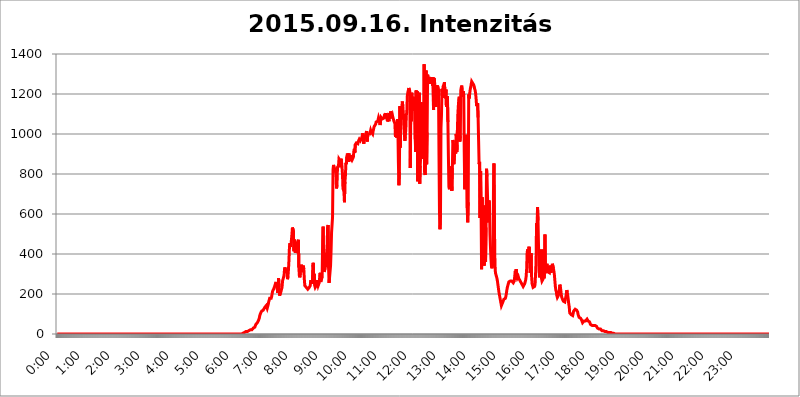
| Category | 2015.09.16. Intenzitás [W/m^2] |
|---|---|
| 0.0 | 0 |
| 0.0006944444444444445 | 0 |
| 0.001388888888888889 | 0 |
| 0.0020833333333333333 | 0 |
| 0.002777777777777778 | 0 |
| 0.003472222222222222 | 0 |
| 0.004166666666666667 | 0 |
| 0.004861111111111111 | 0 |
| 0.005555555555555556 | 0 |
| 0.0062499999999999995 | 0 |
| 0.006944444444444444 | 0 |
| 0.007638888888888889 | 0 |
| 0.008333333333333333 | 0 |
| 0.009027777777777779 | 0 |
| 0.009722222222222222 | 0 |
| 0.010416666666666666 | 0 |
| 0.011111111111111112 | 0 |
| 0.011805555555555555 | 0 |
| 0.012499999999999999 | 0 |
| 0.013194444444444444 | 0 |
| 0.013888888888888888 | 0 |
| 0.014583333333333332 | 0 |
| 0.015277777777777777 | 0 |
| 0.015972222222222224 | 0 |
| 0.016666666666666666 | 0 |
| 0.017361111111111112 | 0 |
| 0.018055555555555557 | 0 |
| 0.01875 | 0 |
| 0.019444444444444445 | 0 |
| 0.02013888888888889 | 0 |
| 0.020833333333333332 | 0 |
| 0.02152777777777778 | 0 |
| 0.022222222222222223 | 0 |
| 0.02291666666666667 | 0 |
| 0.02361111111111111 | 0 |
| 0.024305555555555556 | 0 |
| 0.024999999999999998 | 0 |
| 0.025694444444444447 | 0 |
| 0.02638888888888889 | 0 |
| 0.027083333333333334 | 0 |
| 0.027777777777777776 | 0 |
| 0.02847222222222222 | 0 |
| 0.029166666666666664 | 0 |
| 0.029861111111111113 | 0 |
| 0.030555555555555555 | 0 |
| 0.03125 | 0 |
| 0.03194444444444445 | 0 |
| 0.03263888888888889 | 0 |
| 0.03333333333333333 | 0 |
| 0.034027777777777775 | 0 |
| 0.034722222222222224 | 0 |
| 0.035416666666666666 | 0 |
| 0.036111111111111115 | 0 |
| 0.03680555555555556 | 0 |
| 0.0375 | 0 |
| 0.03819444444444444 | 0 |
| 0.03888888888888889 | 0 |
| 0.03958333333333333 | 0 |
| 0.04027777777777778 | 0 |
| 0.04097222222222222 | 0 |
| 0.041666666666666664 | 0 |
| 0.042361111111111106 | 0 |
| 0.04305555555555556 | 0 |
| 0.043750000000000004 | 0 |
| 0.044444444444444446 | 0 |
| 0.04513888888888889 | 0 |
| 0.04583333333333334 | 0 |
| 0.04652777777777778 | 0 |
| 0.04722222222222222 | 0 |
| 0.04791666666666666 | 0 |
| 0.04861111111111111 | 0 |
| 0.049305555555555554 | 0 |
| 0.049999999999999996 | 0 |
| 0.05069444444444445 | 0 |
| 0.051388888888888894 | 0 |
| 0.052083333333333336 | 0 |
| 0.05277777777777778 | 0 |
| 0.05347222222222222 | 0 |
| 0.05416666666666667 | 0 |
| 0.05486111111111111 | 0 |
| 0.05555555555555555 | 0 |
| 0.05625 | 0 |
| 0.05694444444444444 | 0 |
| 0.057638888888888885 | 0 |
| 0.05833333333333333 | 0 |
| 0.05902777777777778 | 0 |
| 0.059722222222222225 | 0 |
| 0.06041666666666667 | 0 |
| 0.061111111111111116 | 0 |
| 0.06180555555555556 | 0 |
| 0.0625 | 0 |
| 0.06319444444444444 | 0 |
| 0.06388888888888888 | 0 |
| 0.06458333333333334 | 0 |
| 0.06527777777777778 | 0 |
| 0.06597222222222222 | 0 |
| 0.06666666666666667 | 0 |
| 0.06736111111111111 | 0 |
| 0.06805555555555555 | 0 |
| 0.06874999999999999 | 0 |
| 0.06944444444444443 | 0 |
| 0.07013888888888889 | 0 |
| 0.07083333333333333 | 0 |
| 0.07152777777777779 | 0 |
| 0.07222222222222223 | 0 |
| 0.07291666666666667 | 0 |
| 0.07361111111111111 | 0 |
| 0.07430555555555556 | 0 |
| 0.075 | 0 |
| 0.07569444444444444 | 0 |
| 0.0763888888888889 | 0 |
| 0.07708333333333334 | 0 |
| 0.07777777777777778 | 0 |
| 0.07847222222222222 | 0 |
| 0.07916666666666666 | 0 |
| 0.0798611111111111 | 0 |
| 0.08055555555555556 | 0 |
| 0.08125 | 0 |
| 0.08194444444444444 | 0 |
| 0.08263888888888889 | 0 |
| 0.08333333333333333 | 0 |
| 0.08402777777777777 | 0 |
| 0.08472222222222221 | 0 |
| 0.08541666666666665 | 0 |
| 0.08611111111111112 | 0 |
| 0.08680555555555557 | 0 |
| 0.08750000000000001 | 0 |
| 0.08819444444444445 | 0 |
| 0.08888888888888889 | 0 |
| 0.08958333333333333 | 0 |
| 0.09027777777777778 | 0 |
| 0.09097222222222222 | 0 |
| 0.09166666666666667 | 0 |
| 0.09236111111111112 | 0 |
| 0.09305555555555556 | 0 |
| 0.09375 | 0 |
| 0.09444444444444444 | 0 |
| 0.09513888888888888 | 0 |
| 0.09583333333333333 | 0 |
| 0.09652777777777777 | 0 |
| 0.09722222222222222 | 0 |
| 0.09791666666666667 | 0 |
| 0.09861111111111111 | 0 |
| 0.09930555555555555 | 0 |
| 0.09999999999999999 | 0 |
| 0.10069444444444443 | 0 |
| 0.1013888888888889 | 0 |
| 0.10208333333333335 | 0 |
| 0.10277777777777779 | 0 |
| 0.10347222222222223 | 0 |
| 0.10416666666666667 | 0 |
| 0.10486111111111111 | 0 |
| 0.10555555555555556 | 0 |
| 0.10625 | 0 |
| 0.10694444444444444 | 0 |
| 0.1076388888888889 | 0 |
| 0.10833333333333334 | 0 |
| 0.10902777777777778 | 0 |
| 0.10972222222222222 | 0 |
| 0.1111111111111111 | 0 |
| 0.11180555555555556 | 0 |
| 0.11180555555555556 | 0 |
| 0.1125 | 0 |
| 0.11319444444444444 | 0 |
| 0.11388888888888889 | 0 |
| 0.11458333333333333 | 0 |
| 0.11527777777777777 | 0 |
| 0.11597222222222221 | 0 |
| 0.11666666666666665 | 0 |
| 0.1173611111111111 | 0 |
| 0.11805555555555557 | 0 |
| 0.11944444444444445 | 0 |
| 0.12013888888888889 | 0 |
| 0.12083333333333333 | 0 |
| 0.12152777777777778 | 0 |
| 0.12222222222222223 | 0 |
| 0.12291666666666667 | 0 |
| 0.12291666666666667 | 0 |
| 0.12361111111111112 | 0 |
| 0.12430555555555556 | 0 |
| 0.125 | 0 |
| 0.12569444444444444 | 0 |
| 0.12638888888888888 | 0 |
| 0.12708333333333333 | 0 |
| 0.16875 | 0 |
| 0.12847222222222224 | 0 |
| 0.12916666666666668 | 0 |
| 0.12986111111111112 | 0 |
| 0.13055555555555556 | 0 |
| 0.13125 | 0 |
| 0.13194444444444445 | 0 |
| 0.1326388888888889 | 0 |
| 0.13333333333333333 | 0 |
| 0.13402777777777777 | 0 |
| 0.13402777777777777 | 0 |
| 0.13472222222222222 | 0 |
| 0.13541666666666666 | 0 |
| 0.1361111111111111 | 0 |
| 0.13749999999999998 | 0 |
| 0.13819444444444443 | 0 |
| 0.1388888888888889 | 0 |
| 0.13958333333333334 | 0 |
| 0.14027777777777778 | 0 |
| 0.14097222222222222 | 0 |
| 0.14166666666666666 | 0 |
| 0.1423611111111111 | 0 |
| 0.14305555555555557 | 0 |
| 0.14375000000000002 | 0 |
| 0.14444444444444446 | 0 |
| 0.1451388888888889 | 0 |
| 0.1451388888888889 | 0 |
| 0.14652777777777778 | 0 |
| 0.14722222222222223 | 0 |
| 0.14791666666666667 | 0 |
| 0.1486111111111111 | 0 |
| 0.14930555555555555 | 0 |
| 0.15 | 0 |
| 0.15069444444444444 | 0 |
| 0.15138888888888888 | 0 |
| 0.15208333333333332 | 0 |
| 0.15277777777777776 | 0 |
| 0.15347222222222223 | 0 |
| 0.15416666666666667 | 0 |
| 0.15486111111111112 | 0 |
| 0.15555555555555556 | 0 |
| 0.15625 | 0 |
| 0.15694444444444444 | 0 |
| 0.15763888888888888 | 0 |
| 0.15833333333333333 | 0 |
| 0.15902777777777777 | 0 |
| 0.15972222222222224 | 0 |
| 0.16041666666666668 | 0 |
| 0.16111111111111112 | 0 |
| 0.16180555555555556 | 0 |
| 0.1625 | 0 |
| 0.16319444444444445 | 0 |
| 0.1638888888888889 | 0 |
| 0.16458333333333333 | 0 |
| 0.16527777777777777 | 0 |
| 0.16597222222222222 | 0 |
| 0.16666666666666666 | 0 |
| 0.1673611111111111 | 0 |
| 0.16805555555555554 | 0 |
| 0.16874999999999998 | 0 |
| 0.16944444444444443 | 0 |
| 0.17013888888888887 | 0 |
| 0.1708333333333333 | 0 |
| 0.17152777777777775 | 0 |
| 0.17222222222222225 | 0 |
| 0.1729166666666667 | 0 |
| 0.17361111111111113 | 0 |
| 0.17430555555555557 | 0 |
| 0.17500000000000002 | 0 |
| 0.17569444444444446 | 0 |
| 0.1763888888888889 | 0 |
| 0.17708333333333334 | 0 |
| 0.17777777777777778 | 0 |
| 0.17847222222222223 | 0 |
| 0.17916666666666667 | 0 |
| 0.1798611111111111 | 0 |
| 0.18055555555555555 | 0 |
| 0.18125 | 0 |
| 0.18194444444444444 | 0 |
| 0.1826388888888889 | 0 |
| 0.18333333333333335 | 0 |
| 0.1840277777777778 | 0 |
| 0.18472222222222223 | 0 |
| 0.18541666666666667 | 0 |
| 0.18611111111111112 | 0 |
| 0.18680555555555556 | 0 |
| 0.1875 | 0 |
| 0.18819444444444444 | 0 |
| 0.18888888888888888 | 0 |
| 0.18958333333333333 | 0 |
| 0.19027777777777777 | 0 |
| 0.1909722222222222 | 0 |
| 0.19166666666666665 | 0 |
| 0.19236111111111112 | 0 |
| 0.19305555555555554 | 0 |
| 0.19375 | 0 |
| 0.19444444444444445 | 0 |
| 0.1951388888888889 | 0 |
| 0.19583333333333333 | 0 |
| 0.19652777777777777 | 0 |
| 0.19722222222222222 | 0 |
| 0.19791666666666666 | 0 |
| 0.1986111111111111 | 0 |
| 0.19930555555555554 | 0 |
| 0.19999999999999998 | 0 |
| 0.20069444444444443 | 0 |
| 0.20138888888888887 | 0 |
| 0.2020833333333333 | 0 |
| 0.2027777777777778 | 0 |
| 0.2034722222222222 | 0 |
| 0.2041666666666667 | 0 |
| 0.20486111111111113 | 0 |
| 0.20555555555555557 | 0 |
| 0.20625000000000002 | 0 |
| 0.20694444444444446 | 0 |
| 0.2076388888888889 | 0 |
| 0.20833333333333334 | 0 |
| 0.20902777777777778 | 0 |
| 0.20972222222222223 | 0 |
| 0.21041666666666667 | 0 |
| 0.2111111111111111 | 0 |
| 0.21180555555555555 | 0 |
| 0.2125 | 0 |
| 0.21319444444444444 | 0 |
| 0.2138888888888889 | 0 |
| 0.21458333333333335 | 0 |
| 0.2152777777777778 | 0 |
| 0.21597222222222223 | 0 |
| 0.21666666666666667 | 0 |
| 0.21736111111111112 | 0 |
| 0.21805555555555556 | 0 |
| 0.21875 | 0 |
| 0.21944444444444444 | 0 |
| 0.22013888888888888 | 0 |
| 0.22083333333333333 | 0 |
| 0.22152777777777777 | 0 |
| 0.2222222222222222 | 0 |
| 0.22291666666666665 | 0 |
| 0.2236111111111111 | 0 |
| 0.22430555555555556 | 0 |
| 0.225 | 0 |
| 0.22569444444444445 | 0 |
| 0.2263888888888889 | 0 |
| 0.22708333333333333 | 0 |
| 0.22777777777777777 | 0 |
| 0.22847222222222222 | 0 |
| 0.22916666666666666 | 0 |
| 0.2298611111111111 | 0 |
| 0.23055555555555554 | 0 |
| 0.23124999999999998 | 0 |
| 0.23194444444444443 | 0 |
| 0.23263888888888887 | 0 |
| 0.2333333333333333 | 0 |
| 0.2340277777777778 | 0 |
| 0.2347222222222222 | 0 |
| 0.2354166666666667 | 0 |
| 0.23611111111111113 | 0 |
| 0.23680555555555557 | 0 |
| 0.23750000000000002 | 0 |
| 0.23819444444444446 | 0 |
| 0.2388888888888889 | 0 |
| 0.23958333333333334 | 0 |
| 0.24027777777777778 | 0 |
| 0.24097222222222223 | 0 |
| 0.24166666666666667 | 0 |
| 0.2423611111111111 | 0 |
| 0.24305555555555555 | 0 |
| 0.24375 | 0 |
| 0.24444444444444446 | 0 |
| 0.24513888888888888 | 0 |
| 0.24583333333333335 | 0 |
| 0.2465277777777778 | 0 |
| 0.24722222222222223 | 0 |
| 0.24791666666666667 | 0 |
| 0.24861111111111112 | 0 |
| 0.24930555555555556 | 0 |
| 0.25 | 0 |
| 0.25069444444444444 | 0 |
| 0.2513888888888889 | 0 |
| 0.2520833333333333 | 0 |
| 0.25277777777777777 | 0 |
| 0.2534722222222222 | 0 |
| 0.25416666666666665 | 0 |
| 0.2548611111111111 | 0 |
| 0.2555555555555556 | 0 |
| 0.25625000000000003 | 0 |
| 0.2569444444444445 | 0 |
| 0.2576388888888889 | 0 |
| 0.25833333333333336 | 0 |
| 0.2590277777777778 | 0 |
| 0.25972222222222224 | 3.525 |
| 0.2604166666666667 | 3.525 |
| 0.2611111111111111 | 3.525 |
| 0.26180555555555557 | 3.525 |
| 0.2625 | 7.887 |
| 0.26319444444444445 | 7.887 |
| 0.2638888888888889 | 7.887 |
| 0.26458333333333334 | 12.257 |
| 0.2652777777777778 | 12.257 |
| 0.2659722222222222 | 12.257 |
| 0.26666666666666666 | 12.257 |
| 0.2673611111111111 | 12.257 |
| 0.26805555555555555 | 16.636 |
| 0.26875 | 16.636 |
| 0.26944444444444443 | 16.636 |
| 0.2701388888888889 | 21.024 |
| 0.2708333333333333 | 21.024 |
| 0.27152777777777776 | 21.024 |
| 0.2722222222222222 | 21.024 |
| 0.27291666666666664 | 21.024 |
| 0.2736111111111111 | 25.419 |
| 0.2743055555555555 | 25.419 |
| 0.27499999999999997 | 29.823 |
| 0.27569444444444446 | 29.823 |
| 0.27638888888888885 | 34.234 |
| 0.27708333333333335 | 34.234 |
| 0.2777777777777778 | 38.653 |
| 0.27847222222222223 | 47.511 |
| 0.2791666666666667 | 47.511 |
| 0.2798611111111111 | 47.511 |
| 0.28055555555555556 | 56.398 |
| 0.28125 | 60.85 |
| 0.28194444444444444 | 65.31 |
| 0.2826388888888889 | 69.775 |
| 0.2833333333333333 | 78.722 |
| 0.28402777777777777 | 92.184 |
| 0.2847222222222222 | 96.682 |
| 0.28541666666666665 | 105.69 |
| 0.28611111111111115 | 110.201 |
| 0.28680555555555554 | 114.716 |
| 0.28750000000000003 | 114.716 |
| 0.2881944444444445 | 110.201 |
| 0.2888888888888889 | 119.235 |
| 0.28958333333333336 | 123.758 |
| 0.2902777777777778 | 114.716 |
| 0.29097222222222224 | 132.814 |
| 0.2916666666666667 | 137.347 |
| 0.2923611111111111 | 128.284 |
| 0.29305555555555557 | 141.884 |
| 0.29375 | 141.884 |
| 0.29444444444444445 | 128.284 |
| 0.2951388888888889 | 137.347 |
| 0.29583333333333334 | 146.423 |
| 0.2965277777777778 | 160.056 |
| 0.2972222222222222 | 169.156 |
| 0.29791666666666666 | 178.264 |
| 0.2986111111111111 | 178.264 |
| 0.29930555555555555 | 178.264 |
| 0.3 | 178.264 |
| 0.30069444444444443 | 187.378 |
| 0.3013888888888889 | 191.937 |
| 0.3020833333333333 | 214.746 |
| 0.30277777777777776 | 219.309 |
| 0.3034722222222222 | 223.873 |
| 0.30416666666666664 | 228.436 |
| 0.3048611111111111 | 237.564 |
| 0.3055555555555555 | 246.689 |
| 0.30624999999999997 | 251.251 |
| 0.3069444444444444 | 260.373 |
| 0.3076388888888889 | 237.564 |
| 0.30833333333333335 | 246.689 |
| 0.3090277777777778 | 205.62 |
| 0.30972222222222223 | 219.309 |
| 0.3104166666666667 | 278.603 |
| 0.3111111111111111 | 233 |
| 0.31180555555555556 | 191.937 |
| 0.3125 | 191.937 |
| 0.31319444444444444 | 191.937 |
| 0.3138888888888889 | 214.746 |
| 0.3145833333333333 | 219.309 |
| 0.31527777777777777 | 233 |
| 0.3159722222222222 | 264.932 |
| 0.31666666666666665 | 274.047 |
| 0.31736111111111115 | 269.49 |
| 0.31805555555555554 | 292.259 |
| 0.31875000000000003 | 324.052 |
| 0.3194444444444445 | 333.113 |
| 0.3201388888888889 | 319.517 |
| 0.32083333333333336 | 305.898 |
| 0.3215277777777778 | 324.052 |
| 0.32222222222222224 | 314.98 |
| 0.3229166666666667 | 274.047 |
| 0.3236111111111111 | 287.709 |
| 0.32430555555555557 | 324.052 |
| 0.325 | 369.23 |
| 0.32569444444444445 | 436.27 |
| 0.3263888888888889 | 453.968 |
| 0.32708333333333334 | 436.27 |
| 0.3277777777777778 | 445.129 |
| 0.3284722222222222 | 440.702 |
| 0.32916666666666666 | 497.836 |
| 0.3298611111111111 | 532.513 |
| 0.33055555555555555 | 528.2 |
| 0.33125 | 515.223 |
| 0.33194444444444443 | 414.035 |
| 0.3326388888888889 | 471.582 |
| 0.3333333333333333 | 467.187 |
| 0.3340277777777778 | 405.108 |
| 0.3347222222222222 | 418.492 |
| 0.3354166666666667 | 422.943 |
| 0.3361111111111111 | 436.27 |
| 0.3368055555555556 | 458.38 |
| 0.33749999999999997 | 458.38 |
| 0.33819444444444446 | 471.582 |
| 0.33888888888888885 | 333.113 |
| 0.33958333333333335 | 292.259 |
| 0.34027777777777773 | 283.156 |
| 0.34097222222222223 | 305.898 |
| 0.3416666666666666 | 333.113 |
| 0.3423611111111111 | 346.682 |
| 0.3430555555555555 | 328.584 |
| 0.34375 | 324.052 |
| 0.3444444444444445 | 319.517 |
| 0.3451388888888889 | 342.162 |
| 0.3458333333333334 | 324.052 |
| 0.34652777777777777 | 274.047 |
| 0.34722222222222227 | 242.127 |
| 0.34791666666666665 | 237.564 |
| 0.34861111111111115 | 242.127 |
| 0.34930555555555554 | 233 |
| 0.35000000000000003 | 228.436 |
| 0.3506944444444444 | 228.436 |
| 0.3513888888888889 | 223.873 |
| 0.3520833333333333 | 228.436 |
| 0.3527777777777778 | 228.436 |
| 0.3534722222222222 | 233 |
| 0.3541666666666667 | 233 |
| 0.3548611111111111 | 242.127 |
| 0.35555555555555557 | 269.49 |
| 0.35625 | 274.047 |
| 0.35694444444444445 | 264.932 |
| 0.3576388888888889 | 251.251 |
| 0.35833333333333334 | 251.251 |
| 0.3590277777777778 | 355.712 |
| 0.3597222222222222 | 287.709 |
| 0.36041666666666666 | 301.354 |
| 0.3611111111111111 | 242.127 |
| 0.36180555555555555 | 233 |
| 0.3625 | 233 |
| 0.36319444444444443 | 242.127 |
| 0.3638888888888889 | 260.373 |
| 0.3645833333333333 | 269.49 |
| 0.3652777777777778 | 264.932 |
| 0.3659722222222222 | 242.127 |
| 0.3666666666666667 | 242.127 |
| 0.3673611111111111 | 255.813 |
| 0.3680555555555556 | 283.156 |
| 0.36874999999999997 | 305.898 |
| 0.36944444444444446 | 260.373 |
| 0.37013888888888885 | 255.813 |
| 0.37083333333333335 | 264.932 |
| 0.37152777777777773 | 287.709 |
| 0.37222222222222223 | 467.187 |
| 0.3729166666666666 | 536.82 |
| 0.3736111111111111 | 351.198 |
| 0.3743055555555555 | 310.44 |
| 0.375 | 314.98 |
| 0.3756944444444445 | 328.584 |
| 0.3763888888888889 | 324.052 |
| 0.3770833333333334 | 355.712 |
| 0.37777777777777777 | 405.108 |
| 0.37847222222222227 | 440.702 |
| 0.37916666666666665 | 532.513 |
| 0.37986111111111115 | 545.416 |
| 0.38055555555555554 | 328.584 |
| 0.38125000000000003 | 255.813 |
| 0.3819444444444444 | 283.156 |
| 0.3826388888888889 | 283.156 |
| 0.3833333333333333 | 342.162 |
| 0.3840277777777778 | 414.035 |
| 0.3847222222222222 | 506.542 |
| 0.3854166666666667 | 506.542 |
| 0.3861111111111111 | 583.779 |
| 0.38680555555555557 | 822.26 |
| 0.3875 | 845.365 |
| 0.38819444444444445 | 845.365 |
| 0.3888888888888889 | 822.26 |
| 0.38958333333333334 | 829.981 |
| 0.3902777777777778 | 826.123 |
| 0.3909722222222222 | 802.868 |
| 0.39166666666666666 | 727.896 |
| 0.3923611111111111 | 743.859 |
| 0.39305555555555555 | 833.834 |
| 0.39375 | 833.834 |
| 0.39444444444444443 | 841.526 |
| 0.3951388888888889 | 875.918 |
| 0.3958333333333333 | 879.719 |
| 0.3965277777777778 | 868.305 |
| 0.3972222222222222 | 833.834 |
| 0.3979166666666667 | 875.918 |
| 0.3986111111111111 | 864.493 |
| 0.3993055555555556 | 837.682 |
| 0.39999999999999997 | 802.868 |
| 0.40069444444444446 | 727.896 |
| 0.40138888888888885 | 731.896 |
| 0.40208333333333335 | 711.832 |
| 0.40277777777777773 | 658.909 |
| 0.40347222222222223 | 759.723 |
| 0.4041666666666666 | 791.169 |
| 0.4048611111111111 | 856.855 |
| 0.4055555555555555 | 849.199 |
| 0.40625 | 887.309 |
| 0.4069444444444445 | 902.447 |
| 0.4076388888888889 | 887.309 |
| 0.4083333333333334 | 860.676 |
| 0.40902777777777777 | 902.447 |
| 0.40972222222222227 | 864.493 |
| 0.41041666666666665 | 879.719 |
| 0.41111111111111115 | 894.885 |
| 0.41180555555555554 | 875.918 |
| 0.41250000000000003 | 872.114 |
| 0.4131944444444444 | 868.305 |
| 0.4138888888888889 | 864.493 |
| 0.4145833333333333 | 872.114 |
| 0.4152777777777778 | 883.516 |
| 0.4159722222222222 | 913.766 |
| 0.4166666666666667 | 925.06 |
| 0.4173611111111111 | 906.223 |
| 0.41805555555555557 | 947.58 |
| 0.41875 | 943.832 |
| 0.41944444444444445 | 955.071 |
| 0.4201388888888889 | 951.327 |
| 0.42083333333333334 | 955.071 |
| 0.4215277777777778 | 951.327 |
| 0.4222222222222222 | 962.555 |
| 0.42291666666666666 | 966.295 |
| 0.4236111111111111 | 973.772 |
| 0.42430555555555555 | 973.772 |
| 0.425 | 966.295 |
| 0.42569444444444443 | 970.034 |
| 0.4263888888888889 | 966.295 |
| 0.4270833333333333 | 981.244 |
| 0.4277777777777778 | 992.448 |
| 0.4284722222222222 | 1003.65 |
| 0.4291666666666667 | 999.916 |
| 0.4298611111111111 | 951.327 |
| 0.4305555555555556 | 973.772 |
| 0.43124999999999997 | 981.244 |
| 0.43194444444444446 | 996.182 |
| 0.43263888888888885 | 981.244 |
| 0.43333333333333335 | 1007.383 |
| 0.43402777777777773 | 1014.852 |
| 0.43472222222222223 | 962.555 |
| 0.4354166666666666 | 988.714 |
| 0.4361111111111111 | 999.916 |
| 0.4368055555555555 | 1003.65 |
| 0.4375 | 999.916 |
| 0.4381944444444445 | 999.916 |
| 0.4388888888888889 | 1007.383 |
| 0.4395833333333334 | 1018.587 |
| 0.44027777777777777 | 1011.118 |
| 0.44097222222222227 | 1014.852 |
| 0.44166666666666665 | 1007.383 |
| 0.44236111111111115 | 999.916 |
| 0.44305555555555554 | 1014.852 |
| 0.44375000000000003 | 1026.06 |
| 0.4444444444444444 | 1037.277 |
| 0.4451388888888889 | 1041.019 |
| 0.4458333333333333 | 1041.019 |
| 0.4465277777777778 | 1048.508 |
| 0.4472222222222222 | 1059.756 |
| 0.4479166666666667 | 1063.51 |
| 0.4486111111111111 | 1059.756 |
| 0.44930555555555557 | 1063.51 |
| 0.45 | 1071.027 |
| 0.45069444444444445 | 1082.324 |
| 0.4513888888888889 | 1074.789 |
| 0.45208333333333334 | 1078.555 |
| 0.4527777777777778 | 1044.762 |
| 0.4534722222222222 | 1067.267 |
| 0.45416666666666666 | 1082.324 |
| 0.4548611111111111 | 1078.555 |
| 0.45555555555555555 | 1074.789 |
| 0.45625 | 1071.027 |
| 0.45694444444444443 | 1074.789 |
| 0.4576388888888889 | 1078.555 |
| 0.4583333333333333 | 1074.789 |
| 0.4590277777777778 | 1093.653 |
| 0.4597222222222222 | 1101.226 |
| 0.4604166666666667 | 1078.555 |
| 0.4611111111111111 | 1105.019 |
| 0.4618055555555556 | 1082.324 |
| 0.46249999999999997 | 1086.097 |
| 0.46319444444444446 | 1063.51 |
| 0.46388888888888885 | 1078.555 |
| 0.46458333333333335 | 1078.555 |
| 0.46527777777777773 | 1063.51 |
| 0.46597222222222223 | 1105.019 |
| 0.4666666666666666 | 1078.555 |
| 0.4673611111111111 | 1112.618 |
| 0.4680555555555555 | 1097.437 |
| 0.46875 | 1078.555 |
| 0.4694444444444445 | 1082.324 |
| 0.4701388888888889 | 1093.653 |
| 0.4708333333333334 | 1082.324 |
| 0.47152777777777777 | 1078.555 |
| 0.47222222222222227 | 1063.51 |
| 0.47291666666666665 | 1059.756 |
| 0.47361111111111115 | 1052.255 |
| 0.47430555555555554 | 984.98 |
| 0.47500000000000003 | 988.714 |
| 0.4756944444444444 | 1011.118 |
| 0.4763888888888889 | 981.244 |
| 0.4770833333333333 | 1074.789 |
| 0.4777777777777778 | 1022.323 |
| 0.4784722222222222 | 856.855 |
| 0.4791666666666667 | 743.859 |
| 0.4798611111111111 | 810.641 |
| 0.48055555555555557 | 1139.384 |
| 0.48125 | 932.576 |
| 0.48194444444444445 | 1131.708 |
| 0.4826388888888889 | 1112.618 |
| 0.48333333333333334 | 1135.543 |
| 0.4840277777777778 | 1162.571 |
| 0.4847222222222222 | 1135.543 |
| 0.48541666666666666 | 1105.019 |
| 0.4861111111111111 | 1044.762 |
| 0.48680555555555555 | 1041.019 |
| 0.4875 | 966.295 |
| 0.48819444444444443 | 988.714 |
| 0.4888888888888889 | 1026.06 |
| 0.4895833333333333 | 1093.653 |
| 0.4902777777777778 | 1108.816 |
| 0.4909722222222222 | 1189.969 |
| 0.4916666666666667 | 1205.82 |
| 0.4923611111111111 | 1217.812 |
| 0.4930555555555556 | 1229.899 |
| 0.49374999999999997 | 1225.859 |
| 0.49444444444444446 | 1213.804 |
| 0.49513888888888885 | 829.981 |
| 0.49583333333333335 | 1166.46 |
| 0.49652777777777773 | 1063.51 |
| 0.49722222222222223 | 1205.82 |
| 0.4979166666666666 | 1116.426 |
| 0.4986111111111111 | 1162.571 |
| 0.4993055555555555 | 1162.571 |
| 0.5 | 1186.03 |
| 0.5006944444444444 | 1116.426 |
| 0.5013888888888889 | 1170.358 |
| 0.5020833333333333 | 973.772 |
| 0.5027777777777778 | 909.996 |
| 0.5034722222222222 | 1217.812 |
| 0.5041666666666667 | 988.714 |
| 0.5048611111111111 | 1213.804 |
| 0.5055555555555555 | 763.674 |
| 0.50625 | 1048.508 |
| 0.5069444444444444 | 1033.537 |
| 0.5076388888888889 | 1205.82 |
| 0.5083333333333333 | 751.803 |
| 0.5090277777777777 | 841.526 |
| 0.5097222222222222 | 883.516 |
| 0.5104166666666666 | 1158.689 |
| 0.5111111111111112 | 1112.618 |
| 0.5118055555555555 | 1026.06 |
| 0.5125000000000001 | 1063.51 |
| 0.5131944444444444 | 875.918 |
| 0.513888888888889 | 962.555 |
| 0.5145833333333333 | 1348.524 |
| 0.5152777777777778 | 810.641 |
| 0.5159722222222222 | 795.074 |
| 0.5166666666666667 | 891.099 |
| 0.517361111111111 | 1317.736 |
| 0.5180555555555556 | 849.199 |
| 0.5187499999999999 | 1007.383 |
| 0.5194444444444445 | 1296.248 |
| 0.5201388888888888 | 1291.997 |
| 0.5208333333333334 | 1266.8 |
| 0.5215277777777778 | 1283.541 |
| 0.5222222222222223 | 1279.334 |
| 0.5229166666666667 | 1270.964 |
| 0.5236111111111111 | 1250.275 |
| 0.5243055555555556 | 1270.964 |
| 0.525 | 1275.142 |
| 0.5256944444444445 | 1283.541 |
| 0.5263888888888889 | 1242.089 |
| 0.5270833333333333 | 1283.541 |
| 0.5277777777777778 | 1120.238 |
| 0.5284722222222222 | 1279.334 |
| 0.5291666666666667 | 1266.8 |
| 0.5298611111111111 | 1266.8 |
| 0.5305555555555556 | 1158.689 |
| 0.53125 | 1135.543 |
| 0.5319444444444444 | 1242.089 |
| 0.5326388888888889 | 1229.899 |
| 0.5333333333333333 | 1242.089 |
| 0.5340277777777778 | 1238.014 |
| 0.5347222222222222 | 1217.812 |
| 0.5354166666666667 | 894.885 |
| 0.5361111111111111 | 604.864 |
| 0.5368055555555555 | 523.88 |
| 0.5375 | 596.45 |
| 0.5381944444444444 | 1029.798 |
| 0.5388888888888889 | 1093.653 |
| 0.5395833333333333 | 1225.859 |
| 0.5402777777777777 | 1182.099 |
| 0.5409722222222222 | 1186.03 |
| 0.5416666666666666 | 1246.176 |
| 0.5423611111111112 | 1238.014 |
| 0.5430555555555555 | 1258.511 |
| 0.5437500000000001 | 1197.876 |
| 0.5444444444444444 | 1178.177 |
| 0.545138888888889 | 1221.83 |
| 0.5458333333333333 | 1135.543 |
| 0.5465277777777778 | 1135.543 |
| 0.5472222222222222 | 1189.969 |
| 0.5479166666666667 | 1059.756 |
| 0.548611111111111 | 887.309 |
| 0.5493055555555556 | 735.89 |
| 0.5499999999999999 | 723.889 |
| 0.5506944444444445 | 837.682 |
| 0.5513888888888888 | 751.803 |
| 0.5520833333333334 | 735.89 |
| 0.5527777777777778 | 759.723 |
| 0.5534722222222223 | 715.858 |
| 0.5541666666666667 | 829.981 |
| 0.5548611111111111 | 970.034 |
| 0.5555555555555556 | 958.814 |
| 0.55625 | 849.199 |
| 0.5569444444444445 | 849.199 |
| 0.5576388888888889 | 917.534 |
| 0.5583333333333333 | 913.766 |
| 0.5590277777777778 | 902.447 |
| 0.5597222222222222 | 999.916 |
| 0.5604166666666667 | 909.996 |
| 0.5611111111111111 | 1007.383 |
| 0.5618055555555556 | 1093.653 |
| 0.5625 | 1139.384 |
| 0.5631944444444444 | 1170.358 |
| 0.5638888888888889 | 1186.03 |
| 0.5645833333333333 | 962.555 |
| 0.5652777777777778 | 988.714 |
| 0.5659722222222222 | 1217.812 |
| 0.5666666666666667 | 1233.951 |
| 0.5673611111111111 | 1242.089 |
| 0.5680555555555555 | 1197.876 |
| 0.56875 | 1186.03 |
| 0.5694444444444444 | 1213.804 |
| 0.5701388888888889 | 1193.918 |
| 0.5708333333333333 | 909.996 |
| 0.5715277777777777 | 723.889 |
| 0.5722222222222222 | 883.516 |
| 0.5729166666666666 | 955.071 |
| 0.5736111111111112 | 970.034 |
| 0.5743055555555555 | 996.182 |
| 0.5750000000000001 | 629.948 |
| 0.5756944444444444 | 558.261 |
| 0.576388888888889 | 658.909 |
| 0.5770833333333333 | 1197.876 |
| 0.5777777777777778 | 1178.177 |
| 0.5784722222222222 | 1201.843 |
| 0.5791666666666667 | 1221.83 |
| 0.579861111111111 | 1233.951 |
| 0.5805555555555556 | 1229.899 |
| 0.5812499999999999 | 1262.649 |
| 0.5819444444444445 | 1262.649 |
| 0.5826388888888888 | 1254.387 |
| 0.5833333333333334 | 1250.275 |
| 0.5840277777777778 | 1246.176 |
| 0.5847222222222223 | 1238.014 |
| 0.5854166666666667 | 1225.859 |
| 0.5861111111111111 | 1217.812 |
| 0.5868055555555556 | 1201.843 |
| 0.5875 | 1174.263 |
| 0.5881944444444445 | 1139.384 |
| 0.5888888888888889 | 1147.086 |
| 0.5895833333333333 | 1154.814 |
| 0.5902777777777778 | 1082.324 |
| 0.5909722222222222 | 966.295 |
| 0.5916666666666667 | 849.199 |
| 0.5923611111111111 | 860.676 |
| 0.5930555555555556 | 579.542 |
| 0.59375 | 814.519 |
| 0.5944444444444444 | 621.613 |
| 0.5951388888888889 | 324.052 |
| 0.5958333333333333 | 683.473 |
| 0.5965277777777778 | 373.729 |
| 0.5972222222222222 | 480.356 |
| 0.5979166666666667 | 642.4 |
| 0.5986111111111111 | 342.162 |
| 0.5993055555555555 | 360.221 |
| 0.6 | 391.685 |
| 0.6006944444444444 | 360.221 |
| 0.6013888888888889 | 532.513 |
| 0.6020833333333333 | 826.123 |
| 0.6027777777777777 | 787.258 |
| 0.6034722222222222 | 691.608 |
| 0.6041666666666666 | 571.049 |
| 0.6048611111111112 | 558.261 |
| 0.6055555555555555 | 667.123 |
| 0.6062500000000001 | 638.256 |
| 0.6069444444444444 | 497.836 |
| 0.607638888888889 | 431.833 |
| 0.6083333333333333 | 373.729 |
| 0.6090277777777778 | 337.639 |
| 0.6097222222222222 | 328.584 |
| 0.6104166666666667 | 324.052 |
| 0.611111111111111 | 355.712 |
| 0.6118055555555556 | 707.8 |
| 0.6124999999999999 | 853.029 |
| 0.6131944444444445 | 541.121 |
| 0.6138888888888888 | 351.198 |
| 0.6145833333333334 | 305.898 |
| 0.6152777777777778 | 296.808 |
| 0.6159722222222223 | 287.709 |
| 0.6166666666666667 | 278.603 |
| 0.6173611111111111 | 264.932 |
| 0.6180555555555556 | 246.689 |
| 0.61875 | 228.436 |
| 0.6194444444444445 | 210.182 |
| 0.6201388888888889 | 196.497 |
| 0.6208333333333333 | 182.82 |
| 0.6215277777777778 | 169.156 |
| 0.6222222222222222 | 155.509 |
| 0.6229166666666667 | 141.884 |
| 0.6236111111111111 | 141.884 |
| 0.6243055555555556 | 146.423 |
| 0.625 | 160.056 |
| 0.6256944444444444 | 164.605 |
| 0.6263888888888889 | 173.709 |
| 0.6270833333333333 | 173.709 |
| 0.6277777777777778 | 173.709 |
| 0.6284722222222222 | 178.264 |
| 0.6291666666666667 | 187.378 |
| 0.6298611111111111 | 201.058 |
| 0.6305555555555555 | 219.309 |
| 0.63125 | 233 |
| 0.6319444444444444 | 242.127 |
| 0.6326388888888889 | 251.251 |
| 0.6333333333333333 | 260.373 |
| 0.6340277777777777 | 260.373 |
| 0.6347222222222222 | 264.932 |
| 0.6354166666666666 | 264.932 |
| 0.6361111111111112 | 269.49 |
| 0.6368055555555555 | 269.49 |
| 0.6375000000000001 | 264.932 |
| 0.6381944444444444 | 260.373 |
| 0.638888888888889 | 260.373 |
| 0.6395833333333333 | 255.813 |
| 0.6402777777777778 | 255.813 |
| 0.6409722222222222 | 264.932 |
| 0.6416666666666667 | 264.932 |
| 0.642361111111111 | 314.98 |
| 0.6430555555555556 | 301.354 |
| 0.6437499999999999 | 324.052 |
| 0.6444444444444445 | 287.709 |
| 0.6451388888888888 | 278.603 |
| 0.6458333333333334 | 278.603 |
| 0.6465277777777778 | 287.709 |
| 0.6472222222222223 | 278.603 |
| 0.6479166666666667 | 278.603 |
| 0.6486111111111111 | 274.047 |
| 0.6493055555555556 | 264.932 |
| 0.65 | 260.373 |
| 0.6506944444444445 | 255.813 |
| 0.6513888888888889 | 251.251 |
| 0.6520833333333333 | 246.689 |
| 0.6527777777777778 | 242.127 |
| 0.6534722222222222 | 237.564 |
| 0.6541666666666667 | 237.564 |
| 0.6548611111111111 | 242.127 |
| 0.6555555555555556 | 251.251 |
| 0.65625 | 260.373 |
| 0.6569444444444444 | 269.49 |
| 0.6576388888888889 | 287.709 |
| 0.6583333333333333 | 324.052 |
| 0.6590277777777778 | 405.108 |
| 0.6597222222222222 | 422.943 |
| 0.6604166666666667 | 396.164 |
| 0.6611111111111111 | 387.202 |
| 0.6618055555555555 | 436.27 |
| 0.6625 | 355.712 |
| 0.6631944444444444 | 305.898 |
| 0.6638888888888889 | 314.98 |
| 0.6645833333333333 | 405.108 |
| 0.6652777777777777 | 287.709 |
| 0.6659722222222222 | 251.251 |
| 0.6666666666666666 | 242.127 |
| 0.6673611111111111 | 233 |
| 0.6680555555555556 | 228.436 |
| 0.6687500000000001 | 233 |
| 0.6694444444444444 | 237.564 |
| 0.6701388888888888 | 246.689 |
| 0.6708333333333334 | 296.808 |
| 0.6715277777777778 | 360.221 |
| 0.6722222222222222 | 553.986 |
| 0.6729166666666666 | 453.968 |
| 0.6736111111111112 | 634.105 |
| 0.6743055555555556 | 566.793 |
| 0.6749999999999999 | 440.702 |
| 0.6756944444444444 | 324.052 |
| 0.6763888888888889 | 283.156 |
| 0.6770833333333334 | 314.98 |
| 0.6777777777777777 | 422.943 |
| 0.6784722222222223 | 292.259 |
| 0.6791666666666667 | 287.709 |
| 0.6798611111111111 | 264.932 |
| 0.6805555555555555 | 269.49 |
| 0.68125 | 274.047 |
| 0.6819444444444445 | 422.943 |
| 0.6826388888888889 | 278.603 |
| 0.6833333333333332 | 310.44 |
| 0.6840277777777778 | 497.836 |
| 0.6847222222222222 | 305.898 |
| 0.6854166666666667 | 301.354 |
| 0.686111111111111 | 314.98 |
| 0.6868055555555556 | 351.198 |
| 0.6875 | 319.517 |
| 0.6881944444444444 | 310.44 |
| 0.688888888888889 | 305.898 |
| 0.6895833333333333 | 305.898 |
| 0.6902777777777778 | 305.898 |
| 0.6909722222222222 | 342.162 |
| 0.6916666666666668 | 314.98 |
| 0.6923611111111111 | 305.898 |
| 0.6930555555555555 | 319.517 |
| 0.69375 | 333.113 |
| 0.6944444444444445 | 351.198 |
| 0.6951388888888889 | 346.682 |
| 0.6958333333333333 | 328.584 |
| 0.6965277777777777 | 314.98 |
| 0.6972222222222223 | 296.808 |
| 0.6979166666666666 | 296.808 |
| 0.6986111111111111 | 237.564 |
| 0.6993055555555556 | 219.309 |
| 0.7000000000000001 | 210.182 |
| 0.7006944444444444 | 191.937 |
| 0.7013888888888888 | 182.82 |
| 0.7020833333333334 | 187.378 |
| 0.7027777777777778 | 191.937 |
| 0.7034722222222222 | 201.058 |
| 0.7041666666666666 | 219.309 |
| 0.7048611111111112 | 246.689 |
| 0.7055555555555556 | 237.564 |
| 0.7062499999999999 | 219.309 |
| 0.7069444444444444 | 196.497 |
| 0.7076388888888889 | 182.82 |
| 0.7083333333333334 | 178.264 |
| 0.7090277777777777 | 187.378 |
| 0.7097222222222223 | 164.605 |
| 0.7104166666666667 | 160.056 |
| 0.7111111111111111 | 160.056 |
| 0.7118055555555555 | 160.056 |
| 0.7125 | 164.605 |
| 0.7131944444444445 | 182.82 |
| 0.7138888888888889 | 196.497 |
| 0.7145833333333332 | 219.309 |
| 0.7152777777777778 | 210.182 |
| 0.7159722222222222 | 191.937 |
| 0.7166666666666667 | 173.709 |
| 0.717361111111111 | 150.964 |
| 0.7180555555555556 | 137.347 |
| 0.71875 | 105.69 |
| 0.7194444444444444 | 105.69 |
| 0.720138888888889 | 101.184 |
| 0.7208333333333333 | 96.682 |
| 0.7215277777777778 | 96.682 |
| 0.7222222222222222 | 92.184 |
| 0.7229166666666668 | 92.184 |
| 0.7236111111111111 | 92.184 |
| 0.7243055555555555 | 114.716 |
| 0.725 | 119.235 |
| 0.7256944444444445 | 114.716 |
| 0.7263888888888889 | 123.758 |
| 0.7270833333333333 | 119.235 |
| 0.7277777777777777 | 119.235 |
| 0.7284722222222223 | 119.235 |
| 0.7291666666666666 | 114.716 |
| 0.7298611111111111 | 110.201 |
| 0.7305555555555556 | 96.682 |
| 0.7312500000000001 | 92.184 |
| 0.7319444444444444 | 83.205 |
| 0.7326388888888888 | 83.205 |
| 0.7333333333333334 | 83.205 |
| 0.7340277777777778 | 78.722 |
| 0.7347222222222222 | 78.722 |
| 0.7354166666666666 | 69.775 |
| 0.7361111111111112 | 65.31 |
| 0.7368055555555556 | 56.398 |
| 0.7374999999999999 | 56.398 |
| 0.7381944444444444 | 56.398 |
| 0.7388888888888889 | 65.31 |
| 0.7395833333333334 | 65.31 |
| 0.7402777777777777 | 65.31 |
| 0.7409722222222223 | 65.31 |
| 0.7416666666666667 | 69.775 |
| 0.7423611111111111 | 69.775 |
| 0.7430555555555555 | 74.246 |
| 0.74375 | 69.775 |
| 0.7444444444444445 | 65.31 |
| 0.7451388888888889 | 65.31 |
| 0.7458333333333332 | 60.85 |
| 0.7465277777777778 | 60.85 |
| 0.7472222222222222 | 56.398 |
| 0.7479166666666667 | 47.511 |
| 0.748611111111111 | 47.511 |
| 0.7493055555555556 | 43.079 |
| 0.75 | 43.079 |
| 0.7506944444444444 | 43.079 |
| 0.751388888888889 | 38.653 |
| 0.7520833333333333 | 43.079 |
| 0.7527777777777778 | 43.079 |
| 0.7534722222222222 | 43.079 |
| 0.7541666666666668 | 43.079 |
| 0.7548611111111111 | 43.079 |
| 0.7555555555555555 | 38.653 |
| 0.75625 | 38.653 |
| 0.7569444444444445 | 34.234 |
| 0.7576388888888889 | 29.823 |
| 0.7583333333333333 | 29.823 |
| 0.7590277777777777 | 29.823 |
| 0.7597222222222223 | 25.419 |
| 0.7604166666666666 | 25.419 |
| 0.7611111111111111 | 25.419 |
| 0.7618055555555556 | 25.419 |
| 0.7625000000000001 | 25.419 |
| 0.7631944444444444 | 21.024 |
| 0.7638888888888888 | 16.636 |
| 0.7645833333333334 | 16.636 |
| 0.7652777777777778 | 16.636 |
| 0.7659722222222222 | 16.636 |
| 0.7666666666666666 | 16.636 |
| 0.7673611111111112 | 12.257 |
| 0.7680555555555556 | 12.257 |
| 0.7687499999999999 | 12.257 |
| 0.7694444444444444 | 12.257 |
| 0.7701388888888889 | 12.257 |
| 0.7708333333333334 | 7.887 |
| 0.7715277777777777 | 7.887 |
| 0.7722222222222223 | 7.887 |
| 0.7729166666666667 | 7.887 |
| 0.7736111111111111 | 7.887 |
| 0.7743055555555555 | 7.887 |
| 0.775 | 7.887 |
| 0.7756944444444445 | 7.887 |
| 0.7763888888888889 | 7.887 |
| 0.7770833333333332 | 3.525 |
| 0.7777777777777778 | 3.525 |
| 0.7784722222222222 | 3.525 |
| 0.7791666666666667 | 3.525 |
| 0.779861111111111 | 3.525 |
| 0.7805555555555556 | 3.525 |
| 0.78125 | 0 |
| 0.7819444444444444 | 0 |
| 0.782638888888889 | 0 |
| 0.7833333333333333 | 0 |
| 0.7840277777777778 | 0 |
| 0.7847222222222222 | 0 |
| 0.7854166666666668 | 0 |
| 0.7861111111111111 | 0 |
| 0.7868055555555555 | 0 |
| 0.7875 | 0 |
| 0.7881944444444445 | 0 |
| 0.7888888888888889 | 0 |
| 0.7895833333333333 | 0 |
| 0.7902777777777777 | 0 |
| 0.7909722222222223 | 0 |
| 0.7916666666666666 | 0 |
| 0.7923611111111111 | 0 |
| 0.7930555555555556 | 0 |
| 0.7937500000000001 | 0 |
| 0.7944444444444444 | 0 |
| 0.7951388888888888 | 0 |
| 0.7958333333333334 | 0 |
| 0.7965277777777778 | 0 |
| 0.7972222222222222 | 0 |
| 0.7979166666666666 | 0 |
| 0.7986111111111112 | 0 |
| 0.7993055555555556 | 0 |
| 0.7999999999999999 | 0 |
| 0.8006944444444444 | 0 |
| 0.8013888888888889 | 0 |
| 0.8020833333333334 | 0 |
| 0.8027777777777777 | 0 |
| 0.8034722222222223 | 0 |
| 0.8041666666666667 | 0 |
| 0.8048611111111111 | 0 |
| 0.8055555555555555 | 0 |
| 0.80625 | 0 |
| 0.8069444444444445 | 0 |
| 0.8076388888888889 | 0 |
| 0.8083333333333332 | 0 |
| 0.8090277777777778 | 0 |
| 0.8097222222222222 | 0 |
| 0.8104166666666667 | 0 |
| 0.811111111111111 | 0 |
| 0.8118055555555556 | 0 |
| 0.8125 | 0 |
| 0.8131944444444444 | 0 |
| 0.813888888888889 | 0 |
| 0.8145833333333333 | 0 |
| 0.8152777777777778 | 0 |
| 0.8159722222222222 | 0 |
| 0.8166666666666668 | 0 |
| 0.8173611111111111 | 0 |
| 0.8180555555555555 | 0 |
| 0.81875 | 0 |
| 0.8194444444444445 | 0 |
| 0.8201388888888889 | 0 |
| 0.8208333333333333 | 0 |
| 0.8215277777777777 | 0 |
| 0.8222222222222223 | 0 |
| 0.8229166666666666 | 0 |
| 0.8236111111111111 | 0 |
| 0.8243055555555556 | 0 |
| 0.8250000000000001 | 0 |
| 0.8256944444444444 | 0 |
| 0.8263888888888888 | 0 |
| 0.8270833333333334 | 0 |
| 0.8277777777777778 | 0 |
| 0.8284722222222222 | 0 |
| 0.8291666666666666 | 0 |
| 0.8298611111111112 | 0 |
| 0.8305555555555556 | 0 |
| 0.8312499999999999 | 0 |
| 0.8319444444444444 | 0 |
| 0.8326388888888889 | 0 |
| 0.8333333333333334 | 0 |
| 0.8340277777777777 | 0 |
| 0.8347222222222223 | 0 |
| 0.8354166666666667 | 0 |
| 0.8361111111111111 | 0 |
| 0.8368055555555555 | 0 |
| 0.8375 | 0 |
| 0.8381944444444445 | 0 |
| 0.8388888888888889 | 0 |
| 0.8395833333333332 | 0 |
| 0.8402777777777778 | 0 |
| 0.8409722222222222 | 0 |
| 0.8416666666666667 | 0 |
| 0.842361111111111 | 0 |
| 0.8430555555555556 | 0 |
| 0.84375 | 0 |
| 0.8444444444444444 | 0 |
| 0.845138888888889 | 0 |
| 0.8458333333333333 | 0 |
| 0.8465277777777778 | 0 |
| 0.8472222222222222 | 0 |
| 0.8479166666666668 | 0 |
| 0.8486111111111111 | 0 |
| 0.8493055555555555 | 0 |
| 0.85 | 0 |
| 0.8506944444444445 | 0 |
| 0.8513888888888889 | 0 |
| 0.8520833333333333 | 0 |
| 0.8527777777777777 | 0 |
| 0.8534722222222223 | 0 |
| 0.8541666666666666 | 0 |
| 0.8548611111111111 | 0 |
| 0.8555555555555556 | 0 |
| 0.8562500000000001 | 0 |
| 0.8569444444444444 | 0 |
| 0.8576388888888888 | 0 |
| 0.8583333333333334 | 0 |
| 0.8590277777777778 | 0 |
| 0.8597222222222222 | 0 |
| 0.8604166666666666 | 0 |
| 0.8611111111111112 | 0 |
| 0.8618055555555556 | 0 |
| 0.8624999999999999 | 0 |
| 0.8631944444444444 | 0 |
| 0.8638888888888889 | 0 |
| 0.8645833333333334 | 0 |
| 0.8652777777777777 | 0 |
| 0.8659722222222223 | 0 |
| 0.8666666666666667 | 0 |
| 0.8673611111111111 | 0 |
| 0.8680555555555555 | 0 |
| 0.86875 | 0 |
| 0.8694444444444445 | 0 |
| 0.8701388888888889 | 0 |
| 0.8708333333333332 | 0 |
| 0.8715277777777778 | 0 |
| 0.8722222222222222 | 0 |
| 0.8729166666666667 | 0 |
| 0.873611111111111 | 0 |
| 0.8743055555555556 | 0 |
| 0.875 | 0 |
| 0.8756944444444444 | 0 |
| 0.876388888888889 | 0 |
| 0.8770833333333333 | 0 |
| 0.8777777777777778 | 0 |
| 0.8784722222222222 | 0 |
| 0.8791666666666668 | 0 |
| 0.8798611111111111 | 0 |
| 0.8805555555555555 | 0 |
| 0.88125 | 0 |
| 0.8819444444444445 | 0 |
| 0.8826388888888889 | 0 |
| 0.8833333333333333 | 0 |
| 0.8840277777777777 | 0 |
| 0.8847222222222223 | 0 |
| 0.8854166666666666 | 0 |
| 0.8861111111111111 | 0 |
| 0.8868055555555556 | 0 |
| 0.8875000000000001 | 0 |
| 0.8881944444444444 | 0 |
| 0.8888888888888888 | 0 |
| 0.8895833333333334 | 0 |
| 0.8902777777777778 | 0 |
| 0.8909722222222222 | 0 |
| 0.8916666666666666 | 0 |
| 0.8923611111111112 | 0 |
| 0.8930555555555556 | 0 |
| 0.8937499999999999 | 0 |
| 0.8944444444444444 | 0 |
| 0.8951388888888889 | 0 |
| 0.8958333333333334 | 0 |
| 0.8965277777777777 | 0 |
| 0.8972222222222223 | 0 |
| 0.8979166666666667 | 0 |
| 0.8986111111111111 | 0 |
| 0.8993055555555555 | 0 |
| 0.9 | 0 |
| 0.9006944444444445 | 0 |
| 0.9013888888888889 | 0 |
| 0.9020833333333332 | 0 |
| 0.9027777777777778 | 0 |
| 0.9034722222222222 | 0 |
| 0.9041666666666667 | 0 |
| 0.904861111111111 | 0 |
| 0.9055555555555556 | 0 |
| 0.90625 | 0 |
| 0.9069444444444444 | 0 |
| 0.907638888888889 | 0 |
| 0.9083333333333333 | 0 |
| 0.9090277777777778 | 0 |
| 0.9097222222222222 | 0 |
| 0.9104166666666668 | 0 |
| 0.9111111111111111 | 0 |
| 0.9118055555555555 | 0 |
| 0.9125 | 0 |
| 0.9131944444444445 | 0 |
| 0.9138888888888889 | 0 |
| 0.9145833333333333 | 0 |
| 0.9152777777777777 | 0 |
| 0.9159722222222223 | 0 |
| 0.9166666666666666 | 0 |
| 0.9173611111111111 | 0 |
| 0.9180555555555556 | 0 |
| 0.9187500000000001 | 0 |
| 0.9194444444444444 | 0 |
| 0.9201388888888888 | 0 |
| 0.9208333333333334 | 0 |
| 0.9215277777777778 | 0 |
| 0.9222222222222222 | 0 |
| 0.9229166666666666 | 0 |
| 0.9236111111111112 | 0 |
| 0.9243055555555556 | 0 |
| 0.9249999999999999 | 0 |
| 0.9256944444444444 | 0 |
| 0.9263888888888889 | 0 |
| 0.9270833333333334 | 0 |
| 0.9277777777777777 | 0 |
| 0.9284722222222223 | 0 |
| 0.9291666666666667 | 0 |
| 0.9298611111111111 | 0 |
| 0.9305555555555555 | 0 |
| 0.93125 | 0 |
| 0.9319444444444445 | 0 |
| 0.9326388888888889 | 0 |
| 0.9333333333333332 | 0 |
| 0.9340277777777778 | 0 |
| 0.9347222222222222 | 0 |
| 0.9354166666666667 | 0 |
| 0.936111111111111 | 0 |
| 0.9368055555555556 | 0 |
| 0.9375 | 0 |
| 0.9381944444444444 | 0 |
| 0.938888888888889 | 0 |
| 0.9395833333333333 | 0 |
| 0.9402777777777778 | 0 |
| 0.9409722222222222 | 0 |
| 0.9416666666666668 | 0 |
| 0.9423611111111111 | 0 |
| 0.9430555555555555 | 0 |
| 0.94375 | 0 |
| 0.9444444444444445 | 0 |
| 0.9451388888888889 | 0 |
| 0.9458333333333333 | 0 |
| 0.9465277777777777 | 0 |
| 0.9472222222222223 | 0 |
| 0.9479166666666666 | 0 |
| 0.9486111111111111 | 0 |
| 0.9493055555555556 | 0 |
| 0.9500000000000001 | 0 |
| 0.9506944444444444 | 0 |
| 0.9513888888888888 | 0 |
| 0.9520833333333334 | 0 |
| 0.9527777777777778 | 0 |
| 0.9534722222222222 | 0 |
| 0.9541666666666666 | 0 |
| 0.9548611111111112 | 0 |
| 0.9555555555555556 | 0 |
| 0.9562499999999999 | 0 |
| 0.9569444444444444 | 0 |
| 0.9576388888888889 | 0 |
| 0.9583333333333334 | 0 |
| 0.9590277777777777 | 0 |
| 0.9597222222222223 | 0 |
| 0.9604166666666667 | 0 |
| 0.9611111111111111 | 0 |
| 0.9618055555555555 | 0 |
| 0.9625 | 0 |
| 0.9631944444444445 | 0 |
| 0.9638888888888889 | 0 |
| 0.9645833333333332 | 0 |
| 0.9652777777777778 | 0 |
| 0.9659722222222222 | 0 |
| 0.9666666666666667 | 0 |
| 0.967361111111111 | 0 |
| 0.9680555555555556 | 0 |
| 0.96875 | 0 |
| 0.9694444444444444 | 0 |
| 0.970138888888889 | 0 |
| 0.9708333333333333 | 0 |
| 0.9715277777777778 | 0 |
| 0.9722222222222222 | 0 |
| 0.9729166666666668 | 0 |
| 0.9736111111111111 | 0 |
| 0.9743055555555555 | 0 |
| 0.975 | 0 |
| 0.9756944444444445 | 0 |
| 0.9763888888888889 | 0 |
| 0.9770833333333333 | 0 |
| 0.9777777777777777 | 0 |
| 0.9784722222222223 | 0 |
| 0.9791666666666666 | 0 |
| 0.9798611111111111 | 0 |
| 0.9805555555555556 | 0 |
| 0.9812500000000001 | 0 |
| 0.9819444444444444 | 0 |
| 0.9826388888888888 | 0 |
| 0.9833333333333334 | 0 |
| 0.9840277777777778 | 0 |
| 0.9847222222222222 | 0 |
| 0.9854166666666666 | 0 |
| 0.9861111111111112 | 0 |
| 0.9868055555555556 | 0 |
| 0.9874999999999999 | 0 |
| 0.9881944444444444 | 0 |
| 0.9888888888888889 | 0 |
| 0.9895833333333334 | 0 |
| 0.9902777777777777 | 0 |
| 0.9909722222222223 | 0 |
| 0.9916666666666667 | 0 |
| 0.9923611111111111 | 0 |
| 0.9930555555555555 | 0 |
| 0.99375 | 0 |
| 0.9944444444444445 | 0 |
| 0.9951388888888889 | 0 |
| 0.9958333333333332 | 0 |
| 0.9965277777777778 | 0 |
| 0.9972222222222222 | 0 |
| 0.9979166666666667 | 0 |
| 0.998611111111111 | 0 |
| 0.9993055555555556 | 0 |